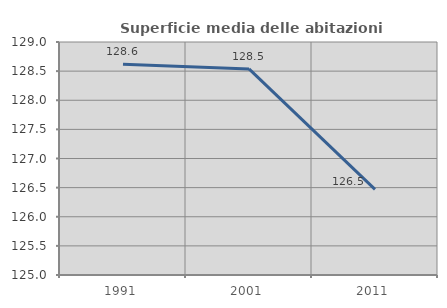
| Category | Superficie media delle abitazioni occupate |
|---|---|
| 1991.0 | 128.617 |
| 2001.0 | 128.538 |
| 2011.0 | 126.469 |